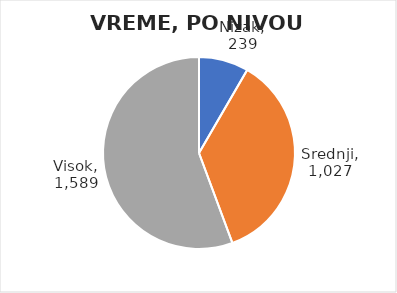
| Category | Ukupno minuta |
|---|---|
| Nizak | 239 |
| Srednji | 1027 |
| Visok | 1589 |